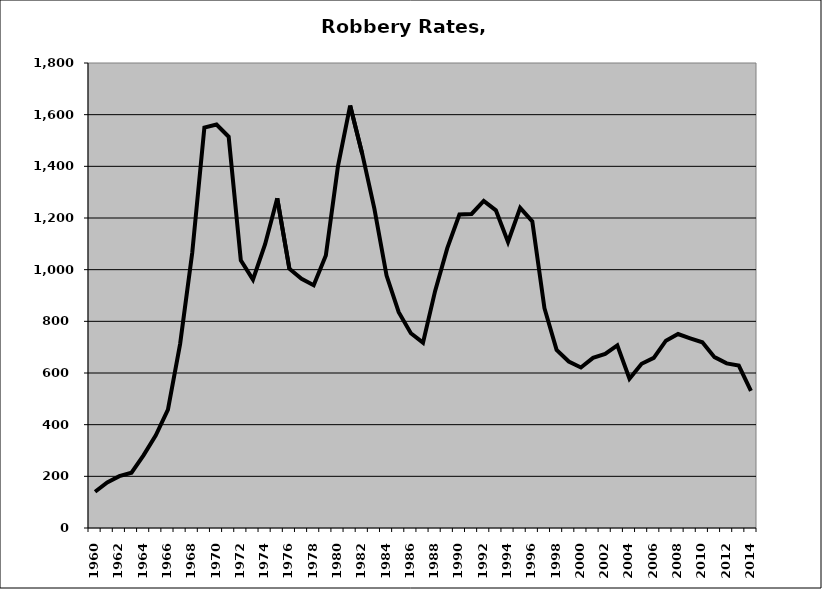
| Category | Robbery |
|---|---|
| 1960.0 | 140.322 |
| 1961.0 | 176.45 |
| 1962.0 | 200.51 |
| 1963.0 | 213.91 |
| 1964.0 | 282.054 |
| 1965.0 | 358.78 |
| 1966.0 | 458.292 |
| 1967.0 | 711.867 |
| 1968.0 | 1065.76 |
| 1969.0 | 1549.624 |
| 1970.0 | 1561.909 |
| 1971.0 | 1514.44 |
| 1972.0 | 1036.23 |
| 1973.0 | 961.26 |
| 1974.0 | 1098.34 |
| 1975.0 | 1276.117 |
| 1976.0 | 1003.419 |
| 1977.0 | 964.493 |
| 1978.0 | 939.614 |
| 1979.0 | 1054.878 |
| 1980.0 | 1400.588 |
| 1981.0 | 1635.063 |
| 1982.0 | 1448.019 |
| 1983.0 | 1235.634 |
| 1984.0 | 977.047 |
| 1985.0 | 835.463 |
| 1986.0 | 753.994 |
| 1987.0 | 717.363 |
| 1988.0 | 917.742 |
| 1989.0 | 1083.113 |
| 1990.0 | 1213.544 |
| 1991.0 | 1215.552 |
| 1992.0 | 1266.384 |
| 1993.0 | 1229.585 |
| 1994.0 | 1107.193 |
| 1995.0 | 1238.989 |
| 1996.0 | 1186.74 |
| 1997.0 | 850.851 |
| 1998.0 | 689.484 |
| 1999.0 | 644.316 |
| 2000.0 | 621.265 |
| 2001.0 | 658.741 |
| 2002.0 | 673.628 |
| 2003.0 | 706.754 |
| 2004.0 | 577.729 |
| 2005.0 | 635.685 |
| 2006.0 | 658.436 |
| 2007.0 | 724.98 |
| 2008.0 | 750.753 |
| 2009.0 | 734.42 |
| 2010.0 | 718.769 |
| 2011.0 | 661.368 |
| 2012.0 | 637.327 |
| 2013.0 | 628.86 |
| 2014.0 | 530.739 |